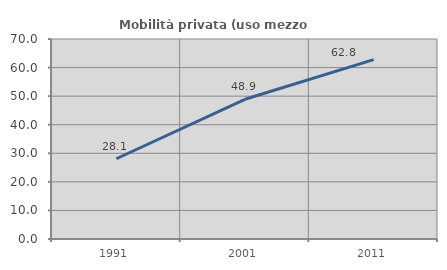
| Category | Mobilità privata (uso mezzo privato) |
|---|---|
| 1991.0 | 28.09 |
| 2001.0 | 48.901 |
| 2011.0 | 62.791 |